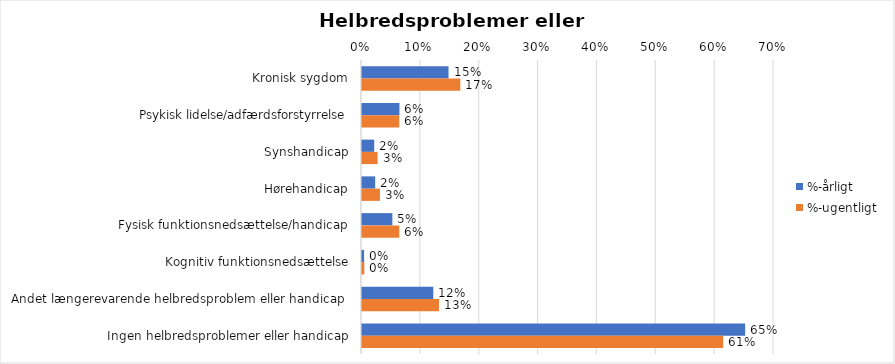
| Category | %-årligt | %-ugentligt |
|---|---|---|
| Kronisk sygdom | 0.147 | 0.167 |
| Psykisk lidelse/adfærdsforstyrrelse | 0.064 | 0.063 |
| Synshandicap | 0.021 | 0.026 |
| Hørehandicap | 0.022 | 0.03 |
| Fysisk funktionsnedsættelse/handicap | 0.052 | 0.063 |
| Kognitiv funktionsnedsættelse | 0.004 | 0.004 |
| Andet længerevarende helbredsproblem eller handicap  | 0.121 | 0.131 |
| Ingen helbredsproblemer eller handicap | 0.651 | 0.614 |